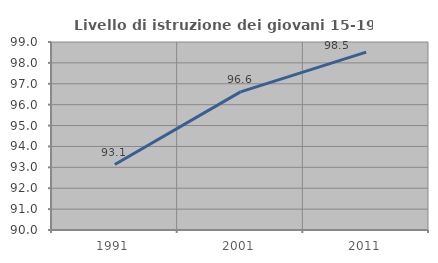
| Category | Livello di istruzione dei giovani 15-19 anni |
|---|---|
| 1991.0 | 93.133 |
| 2001.0 | 96.61 |
| 2011.0 | 98.515 |